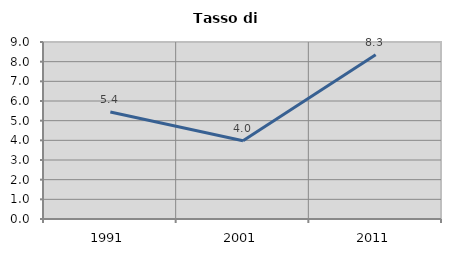
| Category | Tasso di disoccupazione   |
|---|---|
| 1991.0 | 5.443 |
| 2001.0 | 3.983 |
| 2011.0 | 8.349 |